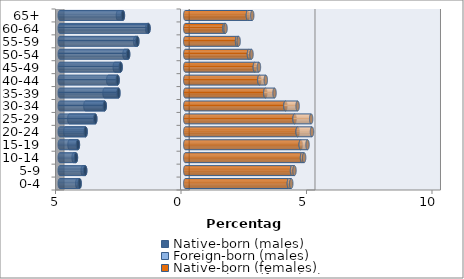
| Category | Native-born (males) | Foreign-born (males) | Native-born (females) | Foreign-born (females) |
|---|---|---|---|---|
| 0-4 | -4.209 | -0.093 | 4.128 | 0.095 |
| 5-9 | -3.987 | -0.101 | 4.254 | 0.097 |
| 10-14 | -4.356 | -0.093 | 4.652 | 0.084 |
| 15-19 | -4.277 | -0.334 | 4.601 | 0.27 |
| 20-24 | -3.97 | -0.808 | 4.478 | 0.571 |
| 25-29 | -3.585 | -1.035 | 4.356 | 0.661 |
| 30-34 | -3.208 | -0.771 | 3.991 | 0.485 |
| 35-39 | -2.663 | -0.554 | 3.19 | 0.367 |
| 40-44 | -2.695 | -0.373 | 2.952 | 0.257 |
| 45-49 | -2.575 | -0.234 | 2.773 | 0.163 |
| 50-54 | -2.275 | -0.145 | 2.537 | 0.102 |
| 55-59 | -1.91 | -0.084 | 2.065 | 0.063 |
| 60-64 | -1.464 | -0.054 | 1.562 | 0.044 |
| 65+ | -2.483 | -0.198 | 2.496 | 0.173 |